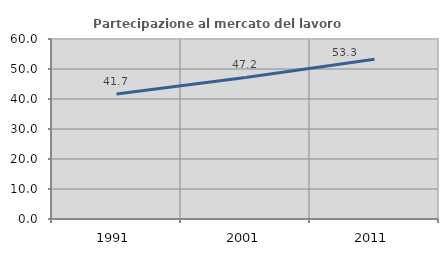
| Category | Partecipazione al mercato del lavoro  femminile |
|---|---|
| 1991.0 | 41.699 |
| 2001.0 | 47.175 |
| 2011.0 | 53.252 |